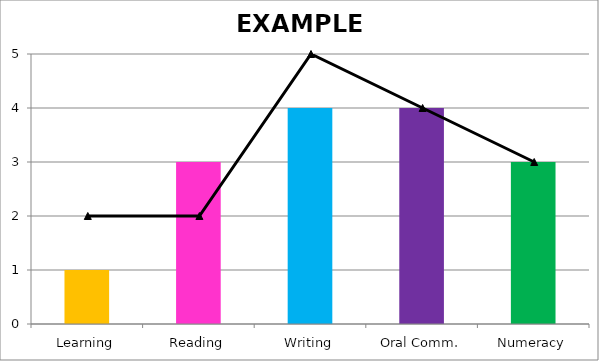
| Category | Training Specification: |
|---|---|
| Learning | 1 |
| Reading | 3 |
| Writing | 4 |
| Oral Comm. | 4 |
| Numeracy | 3 |